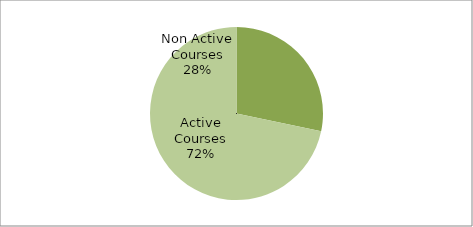
| Category | Series 0 |
|---|---|
| Non Active Courses | 201 |
| Active Courses | 509 |